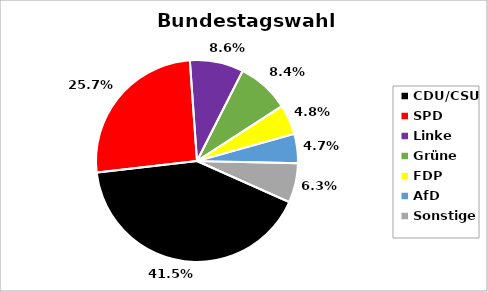
| Category | Series 0 |
|---|---|
| CDU/CSU | 0.415 |
| SPD | 0.257 |
| Linke | 0.086 |
| Grüne | 0.084 |
| FDP | 0.048 |
| AfD | 0.047 |
| Sonstige | 0.063 |